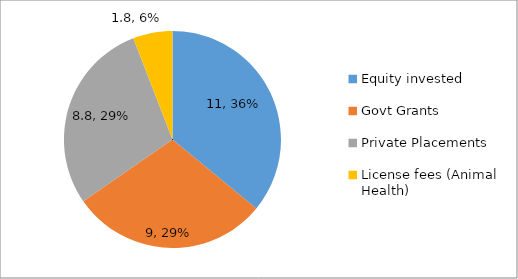
| Category | Series 0 |
|---|---|
| Equity invested | 11 |
| Govt Grants | 9 |
| Private Placements | 8.8 |
| License fees (Animal Health) | 1.8 |